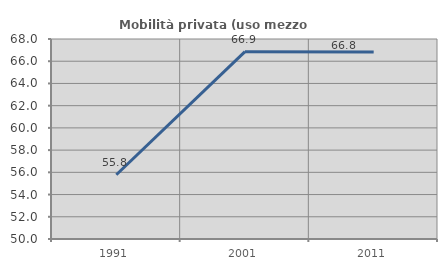
| Category | Mobilità privata (uso mezzo privato) |
|---|---|
| 1991.0 | 55.783 |
| 2001.0 | 66.86 |
| 2011.0 | 66.829 |